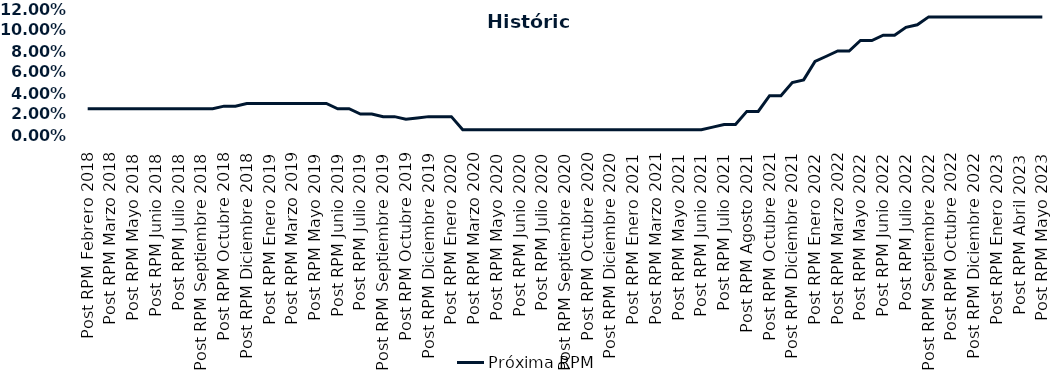
| Category | Próxima RPM |
|---|---|
| Post RPM Febrero 2018 | 0.025 |
| Pre RPM Marzo 2018 | 0.025 |
| Post RPM Marzo 2018 | 0.025 |
| Pre RPM Mayo 2018 | 0.025 |
| Post RPM Mayo 2018 | 0.025 |
| Pre RPM Junio 2018 | 0.025 |
| Post RPM Junio 2018 | 0.025 |
| Pre RPM Julio 2018 | 0.025 |
| Post RPM Julio 2018 | 0.025 |
| Pre RPM Septiembre 2018 | 0.025 |
| Post RPM Septiembre 2018 | 0.025 |
| Pre RPM Octubre 2018 | 0.025 |
| Post RPM Octubre 2018 | 0.028 |
| Pre RPM Diciembre 2018 | 0.028 |
| Post RPM Diciembre 2018 | 0.03 |
| Pre RPM Enero 2019 | 0.03 |
| Post RPM Enero 2019 | 0.03 |
| Pre RPM Marzo 2019 | 0.03 |
| Post RPM Marzo 2019 | 0.03 |
| Pre RPM Mayo 2019 | 0.03 |
| Post RPM Mayo 2019 | 0.03 |
| Pre RPM Junio 2019 | 0.03 |
| Post RPM Junio 2019 | 0.025 |
| Pre RPM Julio 2019 | 0.025 |
| Post RPM Julio 2019 | 0.02 |
| Pre RPM Septiembre 2019 | 0.02 |
| Post RPM Septiembre 2019 | 0.018 |
| Pre RPM Octubre 2019 | 0.018 |
| Post RPM Octubre 2019 | 0.015 |
| Pre RPM Diciembre 2019 | 0.016 |
| Post RPM Diciembre 2019 | 0.018 |
| Pre RPM Enero 2020 | 0.018 |
| Post RPM Enero 2020 | 0.018 |
| Pre RPM Marzo 2020 | 0.005 |
| Post RPM Marzo 2020 | 0.005 |
| Pre RPM Mayo 2020 | 0.005 |
| Post RPM Mayo 2020 | 0.005 |
| Pre RPM Junio 2020 | 0.005 |
| Post RPM Junio 2020 | 0.005 |
| Pre RPM Julio 2020 | 0.005 |
| Post RPM Julio 2020 | 0.005 |
| Pre RPM Septiembre 2020 | 0.005 |
| Post RPM Septiembre 2020 | 0.005 |
| Pre RPM Octubre 2020 | 0.005 |
| Post RPM Octubre 2020 | 0.005 |
| Pre RPM Diciembre 2020 | 0.005 |
| Post RPM Diciembre 2020 | 0.005 |
| Pre RPM Enero 2021 | 0.005 |
| Post RPM Enero 2021 | 0.005 |
| Pre RPM Marzo 2021 | 0.005 |
| Post RPM Marzo 2021 | 0.005 |
| Pre RPM Mayo 2021 | 0.005 |
| Post RPM Mayo 2021 | 0.005 |
| Pre RPM Junio 2021 | 0.005 |
| Post RPM Junio 2021 | 0.005 |
| Pre RPM Julio 2021 | 0.008 |
| Post RPM Julio 2021 | 0.01 |
| Pre RPM Agosto 2021 | 0.01 |
| Post RPM Agosto 2021 | 0.022 |
| Pre RPM Octubre 2021 | 0.022 |
| Post RPM Octubre 2021 | 0.038 |
| Pre RPM Diciembre 2021 | 0.038 |
| Post RPM Diciembre 2021 | 0.05 |
| Pre RPM Enero 2022 | 0.052 |
| Post RPM Enero 2022 | 0.07 |
| Pre RPM Marzo 2022 | 0.075 |
| Post RPM Marzo 2022 | 0.08 |
| Pre RPM Mayo 2022 | 0.08 |
| Post RPM Mayo 2022 | 0.09 |
| Pre RPM Junio 2022 | 0.09 |
| Post RPM Junio 2022 | 0.095 |
| Pre RPM Julio 2022 | 0.095 |
| Post RPM Julio 2022 | 0.102 |
| Pre RPM Septiembre 2022 | 0.105 |
| Post RPM Septiembre 2022 | 0.112 |
| Pre RPM Octubre 2022 | 0.112 |
| Post RPM Octubre 2022 | 0.112 |
| Pre RPM Diciembre 2022 | 0.112 |
| Post RPM Diciembre 2022 | 0.112 |
| Pre RPM Enero 2023 | 0.112 |
| Post RPM Enero 2023 | 0.112 |
| Pre RPM Abril 2023 | 0.112 |
| Post RPM Abril 2023 | 0.112 |
| Pre RPM Mayo 2023 | 0.112 |
| Post RPM Mayo 2023 | 0.112 |